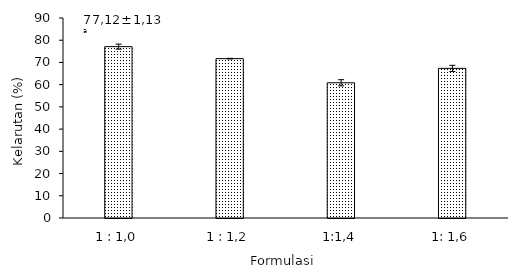
| Category | Kelarutan (%) |
|---|---|
| 1 : 1,0 | 77.115 |
| 1 : 1,2 | 71.716 |
| 1:1,4 | 60.855 |
| 1: 1,6 | 67.326 |